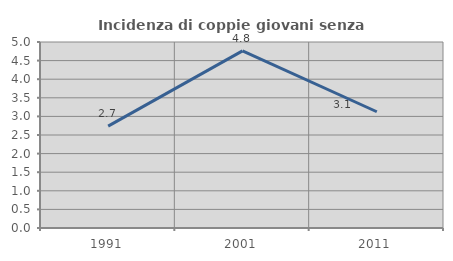
| Category | Incidenza di coppie giovani senza figli |
|---|---|
| 1991.0 | 2.74 |
| 2001.0 | 4.762 |
| 2011.0 | 3.125 |